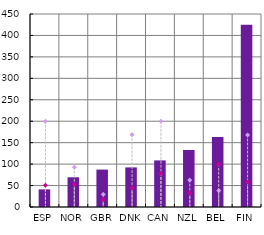
| Category | 2022  (↗) |
|---|---|
| ESP | 41.107 |
| NOR | 69.319 |
| GBR | 87.237 |
| DNK | 92.347 |
| CAN | 108.628 |
| NZL | 132.862 |
| BEL | 163.051 |
| FIN | 424.958 |